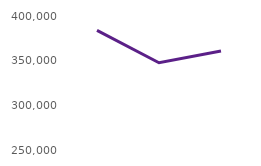
| Category | Users accessing the website |
|---|---|
| Jan24 | 383956 |
| Feb24 | 347656 |
| Mar24 | 360884 |